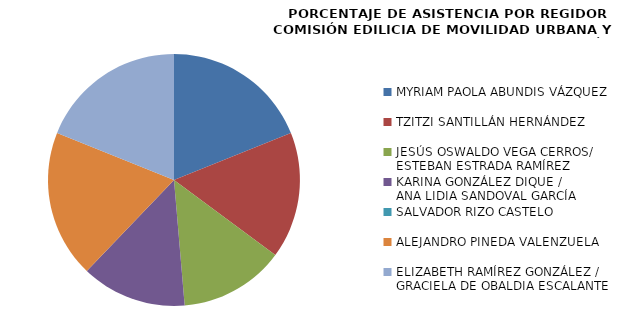
| Category | Series 0 |
|---|---|
| MYRIAM PAOLA ABUNDIS VÁZQUEZ | 100 |
| TZITZI SANTILLÁN HERNÁNDEZ | 85.714 |
| JESÚS OSWALDO VEGA CERROS/ 
ESTEBAN ESTRADA RAMÍREZ | 71.429 |
| KARINA GONZÁLEZ DIQUE /
ANA LIDIA SANDOVAL GARCÍA | 71.429 |
| SALVADOR RIZO CASTELO | 0 |
| ALEJANDRO PINEDA VALENZUELA | 100 |
| ELIZABETH RAMÍREZ GONZÁLEZ /
GRACIELA DE OBALDIA ESCALANTE | 100 |